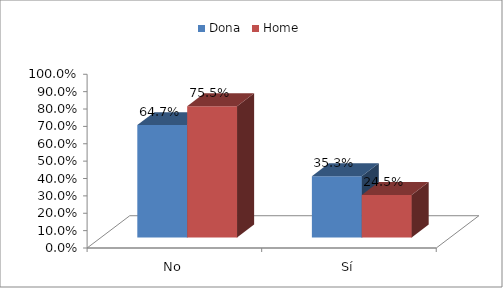
| Category | Dona | Home |
|---|---|---|
| No | 0.647 | 0.755 |
| Sí | 0.353 | 0.245 |